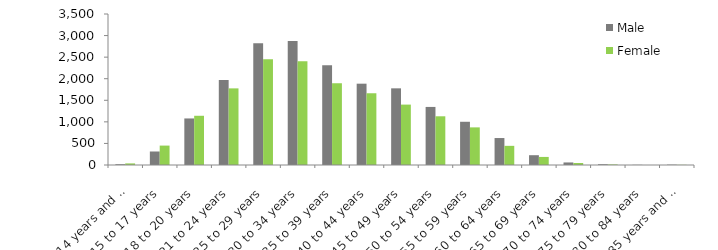
| Category | Male | Female |
|---|---|---|
| 14 years and under | 18 | 37 |
| 15 to 17 years | 313 | 450 |
| 18 to 20 years | 1079 | 1141 |
| 21 to 24 years | 1973 | 1776 |
| 25 to 29 years | 2824 | 2454 |
| 30 to 34 years | 2872 | 2406 |
| 35 to 39 years | 2312 | 1895 |
| 40 to 44 years | 1885 | 1663 |
| 45 to 49 years | 1777 | 1400 |
| 50 to 54 years | 1346 | 1129 |
| 55 to 59 years | 1002 | 872 |
| 60 to 64 years | 625 | 444 |
| 65 to 69 years | 227 | 187 |
| 70 to 74 years | 59 | 47 |
| 75 to 79 years | 18 | 13 |
| 80 to 84 years | 4 | 0 |
| 85 years and over | 8 | 4 |